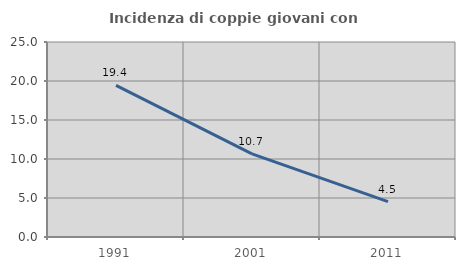
| Category | Incidenza di coppie giovani con figli |
|---|---|
| 1991.0 | 19.435 |
| 2001.0 | 10.658 |
| 2011.0 | 4.529 |